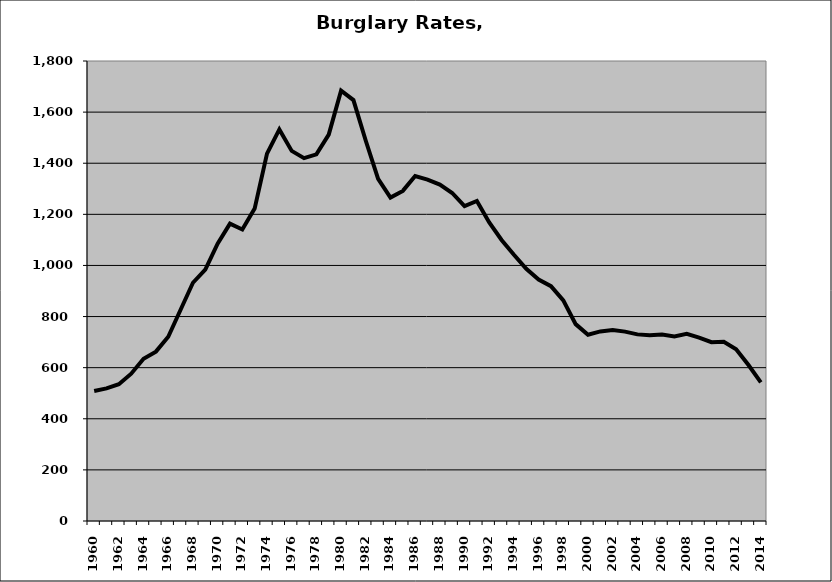
| Category | Burglary |
|---|---|
| 1960.0 | 508.635 |
| 1961.0 | 518.93 |
| 1962.0 | 535.229 |
| 1963.0 | 576.392 |
| 1964.0 | 634.715 |
| 1965.0 | 662.702 |
| 1966.0 | 720.998 |
| 1967.0 | 826.56 |
| 1968.0 | 932.251 |
| 1969.0 | 984.135 |
| 1970.0 | 1084.949 |
| 1971.0 | 1163.511 |
| 1972.0 | 1140.806 |
| 1973.0 | 1222.534 |
| 1974.0 | 1437.708 |
| 1975.0 | 1532.113 |
| 1976.0 | 1448.204 |
| 1977.0 | 1419.808 |
| 1978.0 | 1434.612 |
| 1979.0 | 1511.911 |
| 1980.0 | 1684.141 |
| 1981.0 | 1647.174 |
| 1982.0 | 1487.971 |
| 1983.0 | 1338.733 |
| 1984.0 | 1265.53 |
| 1985.0 | 1291.736 |
| 1986.0 | 1349.84 |
| 1987.0 | 1335.671 |
| 1988.0 | 1316.192 |
| 1989.0 | 1283.599 |
| 1990.0 | 1232.203 |
| 1991.0 | 1252.077 |
| 1992.0 | 1168.446 |
| 1993.0 | 1099.689 |
| 1994.0 | 1042.064 |
| 1995.0 | 986.968 |
| 1996.0 | 944.996 |
| 1997.0 | 918.849 |
| 1998.0 | 863.183 |
| 1999.0 | 770.374 |
| 2000.0 | 728.796 |
| 2001.0 | 741.816 |
| 2002.0 | 747.03 |
| 2003.0 | 741.03 |
| 2004.0 | 730.256 |
| 2005.0 | 726.947 |
| 2006.0 | 729.378 |
| 2007.0 | 722.476 |
| 2008.0 | 732.148 |
| 2009.0 | 717.676 |
| 2010.0 | 699.566 |
| 2011.0 | 701.292 |
| 2012.0 | 672.223 |
| 2013.0 | 610.379 |
| 2014.0 | 542.502 |